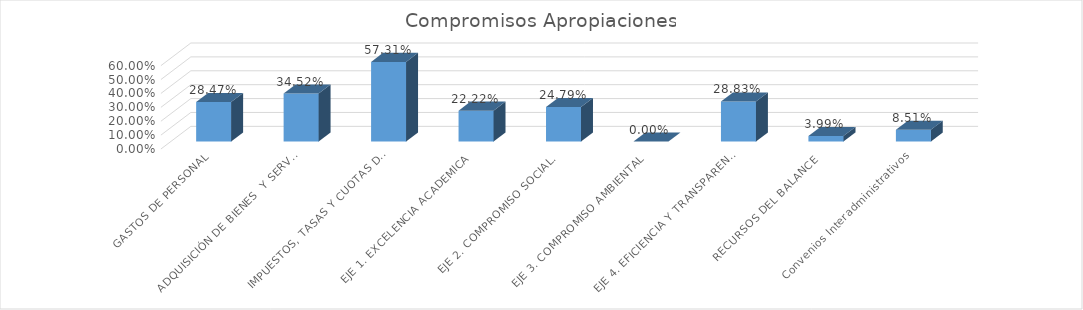
| Category | Series 0 |
|---|---|
| GASTOS DE PERSONAL | 0.285 |
| ADQUISICIÓN DE BIENES  Y SERVICIOS | 0.345 |
| IMPUESTOS, TASAS Y CUOTAS DE FISCALIZACIÓN. | 0.573 |
| EJE 1. EXCELENCIA ACADEMICA | 0.222 |
| EJE 2. COMPROMISO SOCIAL. | 0.248 |
| EJE 3. COMPROMISO AMBIENTAL | 0 |
| EJE 4. EFICIENCIA Y TRANSPARENCIA ADMINISTRATIVA | 0.288 |
| RECURSOS DEL BALANCE | 0.04 |
| Convenios Interadministrativos | 0.085 |